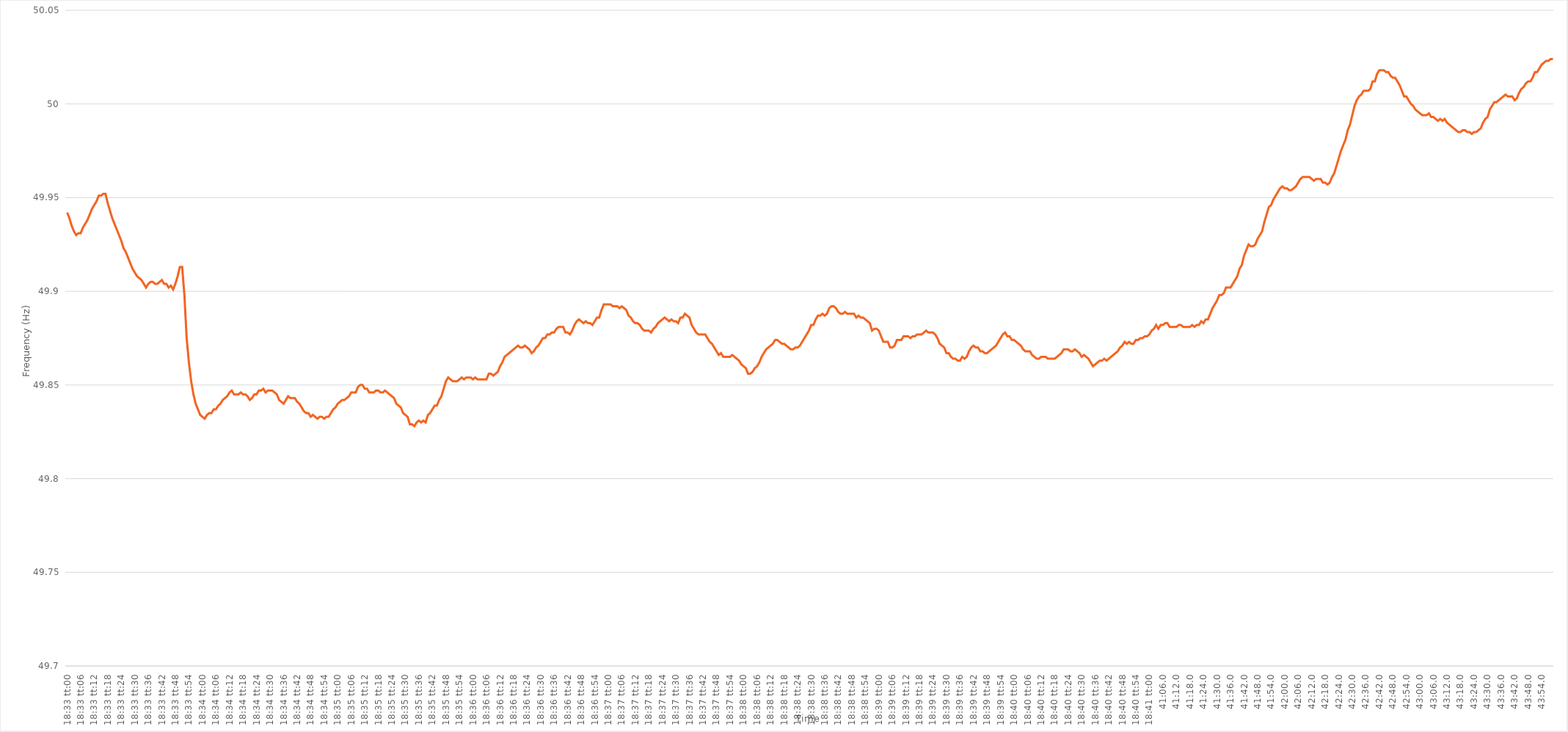
| Category | Series 0 |
|---|---|
| 0.7729166666666667 | 49.942 |
| 0.7729282407407408 | 49.939 |
| 0.7729398148148148 | 49.935 |
| 0.7729513888888889 | 49.932 |
| 0.772962962962963 | 49.93 |
| 0.772974537037037 | 49.931 |
| 0.772986111111111 | 49.931 |
| 0.7729976851851852 | 49.934 |
| 0.7730092592592593 | 49.936 |
| 0.7730208333333333 | 49.938 |
| 0.7730324074074074 | 49.941 |
| 0.7730439814814815 | 49.944 |
| 0.7730555555555556 | 49.946 |
| 0.7730671296296295 | 49.948 |
| 0.7730787037037037 | 49.951 |
| 0.7730902777777778 | 49.951 |
| 0.7731018518518519 | 49.952 |
| 0.7731134259259259 | 49.952 |
| 0.773125 | 49.947 |
| 0.7731365740740741 | 49.943 |
| 0.7731481481481483 | 49.939 |
| 0.7731597222222222 | 49.936 |
| 0.7731712962962963 | 49.933 |
| 0.7731828703703704 | 49.93 |
| 0.7731944444444444 | 49.927 |
| 0.7732060185185184 | 49.923 |
| 0.7732175925925926 | 49.921 |
| 0.7732291666666667 | 49.918 |
| 0.7732407407407407 | 49.915 |
| 0.7732523148148148 | 49.912 |
| 0.7732638888888889 | 49.91 |
| 0.773275462962963 | 49.908 |
| 0.7732870370370369 | 49.907 |
| 0.7732986111111111 | 49.906 |
| 0.7733101851851852 | 49.904 |
| 0.7733217592592593 | 49.902 |
| 0.7733333333333333 | 49.904 |
| 0.7733449074074074 | 49.905 |
| 0.7733564814814815 | 49.905 |
| 0.7733680555555557 | 49.904 |
| 0.7733796296296296 | 49.904 |
| 0.7733912037037037 | 49.905 |
| 0.7734027777777778 | 49.906 |
| 0.7734143518518519 | 49.904 |
| 0.7734259259259259 | 49.904 |
| 0.7734375 | 49.902 |
| 0.7734490740740741 | 49.903 |
| 0.7734606481481481 | 49.901 |
| 0.7734722222222222 | 49.904 |
| 0.7734837962962963 | 49.908 |
| 0.7734953703703704 | 49.913 |
| 0.7735069444444443 | 49.913 |
| 0.7735185185185185 | 49.898 |
| 0.7735300925925926 | 49.875 |
| 0.7735416666666667 | 49.862 |
| 0.7735532407407407 | 49.852 |
| 0.7735648148148148 | 49.845 |
| 0.7735763888888889 | 49.84 |
| 0.7735879629629631 | 49.837 |
| 0.773599537037037 | 49.834 |
| 0.7736111111111111 | 49.833 |
| 0.7736226851851852 | 49.832 |
| 0.7736342592592593 | 49.834 |
| 0.7736458333333333 | 49.835 |
| 0.7736574074074074 | 49.835 |
| 0.7736689814814816 | 49.837 |
| 0.7736805555555556 | 49.837 |
| 0.7736921296296296 | 49.839 |
| 0.7737037037037037 | 49.84 |
| 0.7737152777777778 | 49.842 |
| 0.7737268518518517 | 49.843 |
| 0.7737384259259259 | 49.844 |
| 0.77375 | 49.846 |
| 0.7737615740740741 | 49.847 |
| 0.7737731481481481 | 49.845 |
| 0.7737847222222222 | 49.845 |
| 0.7737962962962963 | 49.845 |
| 0.7738078703703705 | 49.846 |
| 0.7738194444444444 | 49.845 |
| 0.7738310185185185 | 49.845 |
| 0.7738425925925926 | 49.844 |
| 0.7738541666666667 | 49.842 |
| 0.7738657407407407 | 49.843 |
| 0.7738773148148148 | 49.845 |
| 0.773888888888889 | 49.845 |
| 0.773900462962963 | 49.847 |
| 0.773912037037037 | 49.847 |
| 0.7739236111111111 | 49.848 |
| 0.7739351851851852 | 49.846 |
| 0.7739467592592592 | 49.847 |
| 0.7739583333333333 | 49.847 |
| 0.7739699074074075 | 49.847 |
| 0.7739814814814815 | 49.846 |
| 0.7739930555555555 | 49.845 |
| 0.7740046296296296 | 49.842 |
| 0.7740162037037037 | 49.841 |
| 0.7740277777777779 | 49.84 |
| 0.7740393518518518 | 49.842 |
| 0.774050925925926 | 49.844 |
| 0.7740625 | 49.843 |
| 0.7740740740740741 | 49.843 |
| 0.7740856481481481 | 49.843 |
| 0.7740972222222222 | 49.841 |
| 0.7741087962962964 | 49.84 |
| 0.7741203703703704 | 49.838 |
| 0.7741319444444444 | 49.836 |
| 0.7741435185185185 | 49.835 |
| 0.7741550925925926 | 49.835 |
| 0.7741666666666666 | 49.833 |
| 0.7741782407407407 | 49.834 |
| 0.7741898148148149 | 49.833 |
| 0.7742013888888889 | 49.832 |
| 0.7742129629629629 | 49.833 |
| 0.774224537037037 | 49.833 |
| 0.7742361111111111 | 49.832 |
| 0.7742476851851853 | 49.833 |
| 0.7742592592592592 | 49.833 |
| 0.7742708333333334 | 49.835 |
| 0.7742824074074074 | 49.837 |
| 0.7742939814814815 | 49.838 |
| 0.7743055555555555 | 49.84 |
| 0.7743171296296296 | 49.841 |
| 0.7743287037037038 | 49.842 |
| 0.7743402777777778 | 49.842 |
| 0.7743518518518518 | 49.843 |
| 0.7743634259259259 | 49.844 |
| 0.774375 | 49.846 |
| 0.774386574074074 | 49.846 |
| 0.7743981481481481 | 49.846 |
| 0.7744097222222223 | 49.849 |
| 0.7744212962962963 | 49.85 |
| 0.7744328703703703 | 49.85 |
| 0.7744444444444444 | 49.848 |
| 0.7744560185185185 | 49.848 |
| 0.7744675925925927 | 49.846 |
| 0.7744791666666666 | 49.846 |
| 0.7744907407407408 | 49.846 |
| 0.7745023148148148 | 49.847 |
| 0.774513888888889 | 49.847 |
| 0.7745254629629629 | 49.846 |
| 0.774537037037037 | 49.846 |
| 0.7745486111111112 | 49.847 |
| 0.7745601851851852 | 49.846 |
| 0.7745717592592593 | 49.845 |
| 0.7745833333333333 | 49.844 |
| 0.7745949074074074 | 49.843 |
| 0.7746064814814814 | 49.84 |
| 0.7746180555555555 | 49.839 |
| 0.7746296296296297 | 49.838 |
| 0.7746412037037037 | 49.835 |
| 0.7746527777777777 | 49.834 |
| 0.7746643518518518 | 49.833 |
| 0.7746759259259259 | 49.829 |
| 0.7746875000000001 | 49.829 |
| 0.774699074074074 | 49.828 |
| 0.7747106481481482 | 49.83 |
| 0.7747222222222222 | 49.831 |
| 0.7747337962962964 | 49.83 |
| 0.7747453703703703 | 49.831 |
| 0.7747569444444444 | 49.83 |
| 0.7747685185185186 | 49.834 |
| 0.7747800925925926 | 49.835 |
| 0.7747916666666667 | 49.837 |
| 0.7748032407407407 | 49.839 |
| 0.7748148148148148 | 49.839 |
| 0.774826388888889 | 49.842 |
| 0.7748379629629629 | 49.844 |
| 0.7748495370370371 | 49.848 |
| 0.7748611111111111 | 49.852 |
| 0.7748726851851853 | 49.854 |
| 0.7748842592592592 | 49.853 |
| 0.7748958333333333 | 49.852 |
| 0.7749074074074075 | 49.852 |
| 0.7749189814814814 | 49.852 |
| 0.7749305555555556 | 49.853 |
| 0.7749421296296296 | 49.854 |
| 0.7749537037037038 | 49.853 |
| 0.7749652777777777 | 49.854 |
| 0.7749768518518518 | 49.854 |
| 0.774988425925926 | 49.854 |
| 0.775 | 49.853 |
| 0.7750115740740741 | 49.854 |
| 0.7750231481481481 | 49.853 |
| 0.7750347222222222 | 49.853 |
| 0.7750462962962964 | 49.853 |
| 0.7750578703703703 | 49.853 |
| 0.7750694444444445 | 49.853 |
| 0.7750810185185185 | 49.856 |
| 0.7750925925925927 | 49.856 |
| 0.7751041666666666 | 49.855 |
| 0.7751157407407407 | 49.856 |
| 0.7751273148148149 | 49.857 |
| 0.7751388888888888 | 49.86 |
| 0.775150462962963 | 49.862 |
| 0.775162037037037 | 49.865 |
| 0.7751736111111112 | 49.866 |
| 0.7751851851851851 | 49.867 |
| 0.7751967592592592 | 49.868 |
| 0.7752083333333334 | 49.869 |
| 0.7752199074074074 | 49.87 |
| 0.7752314814814815 | 49.871 |
| 0.7752430555555555 | 49.87 |
| 0.7752546296296297 | 49.87 |
| 0.7752662037037038 | 49.871 |
| 0.7752777777777777 | 49.87 |
| 0.7752893518518519 | 49.869 |
| 0.7753009259259259 | 49.867 |
| 0.7753125000000001 | 49.868 |
| 0.775324074074074 | 49.87 |
| 0.7753356481481481 | 49.871 |
| 0.7753472222222223 | 49.873 |
| 0.7753587962962962 | 49.875 |
| 0.7753703703703704 | 49.875 |
| 0.7753819444444444 | 49.877 |
| 0.7753935185185186 | 49.877 |
| 0.7754050925925925 | 49.878 |
| 0.7754166666666666 | 49.878 |
| 0.7754282407407408 | 49.88 |
| 0.7754398148148148 | 49.881 |
| 0.7754513888888889 | 49.881 |
| 0.7754629629629629 | 49.881 |
| 0.7754745370370371 | 49.878 |
| 0.7754861111111112 | 49.878 |
| 0.7754976851851851 | 49.877 |
| 0.7755092592592593 | 49.879 |
| 0.7755208333333333 | 49.882 |
| 0.7755324074074075 | 49.884 |
| 0.7755439814814814 | 49.885 |
| 0.7755555555555556 | 49.884 |
| 0.7755671296296297 | 49.883 |
| 0.7755787037037036 | 49.884 |
| 0.7755902777777778 | 49.883 |
| 0.7756018518518518 | 49.883 |
| 0.775613425925926 | 49.882 |
| 0.7756249999999999 | 49.884 |
| 0.775636574074074 | 49.886 |
| 0.7756481481481482 | 49.886 |
| 0.7756597222222222 | 49.89 |
| 0.7756712962962963 | 49.893 |
| 0.7756828703703703 | 49.893 |
| 0.7756944444444445 | 49.893 |
| 0.7757060185185186 | 49.893 |
| 0.7757175925925925 | 49.892 |
| 0.7757291666666667 | 49.892 |
| 0.7757407407407407 | 49.892 |
| 0.7757523148148149 | 49.891 |
| 0.7757638888888888 | 49.892 |
| 0.775775462962963 | 49.891 |
| 0.7757870370370371 | 49.89 |
| 0.775798611111111 | 49.887 |
| 0.7758101851851852 | 49.886 |
| 0.7758217592592592 | 49.884 |
| 0.7758333333333334 | 49.883 |
| 0.7758449074074073 | 49.883 |
| 0.7758564814814815 | 49.882 |
| 0.7758680555555556 | 49.88 |
| 0.7758796296296296 | 49.879 |
| 0.7758912037037037 | 49.879 |
| 0.7759027777777777 | 49.879 |
| 0.7759143518518519 | 49.878 |
| 0.775925925925926 | 49.88 |
| 0.7759375 | 49.881 |
| 0.7759490740740741 | 49.883 |
| 0.7759606481481481 | 49.884 |
| 0.7759722222222223 | 49.885 |
| 0.7759837962962962 | 49.886 |
| 0.7759953703703704 | 49.885 |
| 0.7760069444444445 | 49.884 |
| 0.7760185185185186 | 49.885 |
| 0.7760300925925926 | 49.884 |
| 0.7760416666666666 | 49.884 |
| 0.7760532407407408 | 49.883 |
| 0.7760648148148147 | 49.886 |
| 0.7760763888888889 | 49.886 |
| 0.776087962962963 | 49.888 |
| 0.776099537037037 | 49.887 |
| 0.7761111111111111 | 49.886 |
| 0.7761226851851851 | 49.882 |
| 0.7761342592592593 | 49.88 |
| 0.7761458333333334 | 49.878 |
| 0.7761574074074074 | 49.877 |
| 0.7761689814814815 | 49.877 |
| 0.7761805555555555 | 49.877 |
| 0.7761921296296297 | 49.877 |
| 0.7762037037037036 | 49.875 |
| 0.7762152777777778 | 49.873 |
| 0.7762268518518519 | 49.872 |
| 0.776238425925926 | 49.87 |
| 0.77625 | 49.868 |
| 0.776261574074074 | 49.866 |
| 0.7762731481481482 | 49.867 |
| 0.7762847222222223 | 49.865 |
| 0.7762962962962963 | 49.865 |
| 0.7763078703703704 | 49.865 |
| 0.7763194444444445 | 49.865 |
| 0.7763310185185185 | 49.866 |
| 0.7763425925925925 | 49.865 |
| 0.7763541666666667 | 49.864 |
| 0.7763657407407408 | 49.863 |
| 0.7763773148148148 | 49.861 |
| 0.7763888888888889 | 49.86 |
| 0.776400462962963 | 49.859 |
| 0.7764120370370371 | 49.856 |
| 0.776423611111111 | 49.856 |
| 0.7764351851851852 | 49.857 |
| 0.7764467592592593 | 49.859 |
| 0.7764583333333334 | 49.86 |
| 0.7764699074074074 | 49.862 |
| 0.7764814814814814 | 49.865 |
| 0.7764930555555556 | 49.867 |
| 0.7765046296296297 | 49.869 |
| 0.7765162037037037 | 49.87 |
| 0.7765277777777778 | 49.871 |
| 0.7765393518518519 | 49.872 |
| 0.7765509259259259 | 49.874 |
| 0.7765624999999999 | 49.874 |
| 0.7765740740740741 | 49.873 |
| 0.7765856481481482 | 49.872 |
| 0.7765972222222222 | 49.872 |
| 0.7766087962962963 | 49.871 |
| 0.7766203703703703 | 49.87 |
| 0.7766319444444445 | 49.869 |
| 0.7766435185185184 | 49.869 |
| 0.7766550925925926 | 49.87 |
| 0.7766666666666667 | 49.87 |
| 0.7766782407407408 | 49.871 |
| 0.7766898148148148 | 49.873 |
| 0.7767013888888888 | 49.875 |
| 0.776712962962963 | 49.877 |
| 0.7767245370370371 | 49.879 |
| 0.7767361111111111 | 49.882 |
| 0.7767476851851852 | 49.882 |
| 0.7767592592592593 | 49.885 |
| 0.7767708333333333 | 49.887 |
| 0.7767824074074073 | 49.887 |
| 0.7767939814814815 | 49.888 |
| 0.7768055555555556 | 49.887 |
| 0.7768171296296296 | 49.888 |
| 0.7768287037037037 | 49.891 |
| 0.7768402777777778 | 49.892 |
| 0.7768518518518519 | 49.892 |
| 0.7768634259259258 | 49.891 |
| 0.776875 | 49.889 |
| 0.7768865740740741 | 49.888 |
| 0.7768981481481482 | 49.888 |
| 0.7769097222222222 | 49.889 |
| 0.7769212962962962 | 49.888 |
| 0.7769328703703704 | 49.888 |
| 0.7769444444444445 | 49.888 |
| 0.7769560185185185 | 49.888 |
| 0.7769675925925926 | 49.886 |
| 0.7769791666666667 | 49.887 |
| 0.7769907407407407 | 49.886 |
| 0.7770023148148147 | 49.886 |
| 0.7770138888888889 | 49.885 |
| 0.777025462962963 | 49.884 |
| 0.777037037037037 | 49.883 |
| 0.7770486111111111 | 49.879 |
| 0.7770601851851852 | 49.88 |
| 0.7770717592592593 | 49.88 |
| 0.7770833333333332 | 49.879 |
| 0.7770949074074074 | 49.876 |
| 0.7771064814814815 | 49.873 |
| 0.7771180555555556 | 49.873 |
| 0.7771296296296296 | 49.873 |
| 0.7771412037037037 | 49.87 |
| 0.7771527777777778 | 49.87 |
| 0.777164351851852 | 49.871 |
| 0.7771759259259259 | 49.874 |
| 0.7771875 | 49.874 |
| 0.7771990740740741 | 49.874 |
| 0.7772106481481481 | 49.876 |
| 0.7772222222222221 | 49.876 |
| 0.7772337962962963 | 49.876 |
| 0.7772453703703704 | 49.875 |
| 0.7772569444444444 | 49.876 |
| 0.7772685185185185 | 49.876 |
| 0.7772800925925926 | 49.877 |
| 0.7772916666666667 | 49.877 |
| 0.7773032407407406 | 49.877 |
| 0.7773148148148148 | 49.878 |
| 0.7773263888888889 | 49.879 |
| 0.777337962962963 | 49.878 |
| 0.777349537037037 | 49.878 |
| 0.7773611111111111 | 49.878 |
| 0.7773726851851852 | 49.877 |
| 0.7773842592592594 | 49.875 |
| 0.7773958333333333 | 49.872 |
| 0.7774074074074074 | 49.871 |
| 0.7774189814814815 | 49.87 |
| 0.7774305555555556 | 49.867 |
| 0.7774421296296296 | 49.867 |
| 0.7774537037037037 | 49.865 |
| 0.7774652777777779 | 49.864 |
| 0.7774768518518519 | 49.864 |
| 0.7774884259259259 | 49.863 |
| 0.7775 | 49.863 |
| 0.7775115740740741 | 49.865 |
| 0.777523148148148 | 49.864 |
| 0.7775347222222222 | 49.865 |
| 0.7775462962962963 | 49.868 |
| 0.7775578703703704 | 49.87 |
| 0.7775694444444444 | 49.871 |
| 0.7775810185185185 | 49.87 |
| 0.7775925925925926 | 49.87 |
| 0.7776041666666668 | 49.868 |
| 0.7776157407407407 | 49.868 |
| 0.7776273148148148 | 49.867 |
| 0.7776388888888889 | 49.867 |
| 0.777650462962963 | 49.868 |
| 0.777662037037037 | 49.869 |
| 0.7776736111111111 | 49.87 |
| 0.7776851851851853 | 49.871 |
| 0.7776967592592593 | 49.873 |
| 0.7777083333333333 | 49.875 |
| 0.7777199074074074 | 49.877 |
| 0.7777314814814815 | 49.878 |
| 0.7777430555555555 | 49.876 |
| 0.7777546296296296 | 49.876 |
| 0.7777662037037038 | 49.874 |
| 0.7777777777777778 | 49.874 |
| 0.7777893518518518 | 49.873 |
| 0.7778009259259259 | 49.872 |
| 0.7778125 | 49.871 |
| 0.7778240740740742 | 49.869 |
| 0.7778356481481481 | 49.868 |
| 0.7778472222222222 | 49.868 |
| 0.7778587962962963 | 49.868 |
| 0.7778703703703704 | 49.866 |
| 0.7778819444444444 | 49.865 |
| 0.7778935185185185 | 49.864 |
| 0.7779050925925927 | 49.864 |
| 0.7779166666666667 | 49.865 |
| 0.7779282407407407 | 49.865 |
| 0.7779398148148148 | 49.865 |
| 0.7779513888888889 | 49.864 |
| 0.7779629629629629 | 49.864 |
| 0.777974537037037 | 49.864 |
| 0.7779861111111112 | 49.864 |
| 0.7779976851851852 | 49.865 |
| 0.7780092592592592 | 49.866 |
| 0.7780208333333333 | 49.867 |
| 0.7780324074074074 | 49.869 |
| 0.7780439814814816 | 49.869 |
| 0.7780555555555555 | 49.869 |
| 0.7780671296296297 | 49.868 |
| 0.7780787037037037 | 49.868 |
| 0.7780902777777778 | 49.869 |
| 0.7781018518518518 | 49.868 |
| 0.7781134259259259 | 49.867 |
| 0.7781250000000001 | 49.865 |
| 0.7781365740740741 | 49.866 |
| 0.7781481481481481 | 49.865 |
| 0.7781597222222222 | 49.864 |
| 0.7781712962962963 | 49.862 |
| 0.7781828703703703 | 49.86 |
| 0.7781944444444444 | 49.861 |
| 0.7782060185185186 | 49.862 |
| 0.7782175925925926 | 49.863 |
| 0.7782291666666666 | 49.863 |
| 0.7782407407407407 | 49.864 |
| 0.7782523148148148 | 49.863 |
| 0.778263888888889 | 49.864 |
| 0.7782754629629629 | 49.865 |
| 0.778287037037037 | 49.866 |
| 0.7782986111111111 | 49.867 |
| 0.7783101851851852 | 49.868 |
| 0.7783217592592592 | 49.87 |
| 0.7783333333333333 | 49.871 |
| 0.7783449074074075 | 49.873 |
| 0.7783564814814815 | 49.872 |
| 0.7783680555555555 | 49.873 |
| 0.7783796296296296 | 49.872 |
| 0.7783912037037037 | 49.872 |
| 0.7784027777777777 | 49.874 |
| 0.7784143518518518 | 49.874 |
| 0.778425925925926 | 49.875 |
| 0.7784375 | 49.875 |
| 0.778449074074074 | 49.876 |
| 0.7784606481481481 | 49.876 |
| 0.7784722222222222 | 49.877 |
| 0.7784837962962964 | 49.879 |
| 0.7784953703703703 | 49.88 |
| 0.7785069444444445 | 49.882 |
| 0.7785185185185185 | 49.88 |
| 0.7785300925925926 | 49.882 |
| 0.7785416666666666 | 49.882 |
| 0.7785532407407407 | 49.883 |
| 0.7785648148148149 | 49.883 |
| 0.7785763888888889 | 49.881 |
| 0.778587962962963 | 49.881 |
| 0.778599537037037 | 49.881 |
| 0.7786111111111111 | 49.881 |
| 0.7786226851851853 | 49.882 |
| 0.7786342592592592 | 49.882 |
| 0.7786458333333334 | 49.881 |
| 0.7786574074074074 | 49.881 |
| 0.7786689814814814 | 49.881 |
| 0.7786805555555555 | 49.881 |
| 0.7786921296296296 | 49.882 |
| 0.7787037037037038 | 49.881 |
| 0.7787152777777777 | 49.882 |
| 0.7787268518518519 | 49.882 |
| 0.7787384259259259 | 49.884 |
| 0.77875 | 49.883 |
| 0.778761574074074 | 49.885 |
| 0.7787731481481481 | 49.885 |
| 0.7787847222222223 | 49.888 |
| 0.7787962962962963 | 49.891 |
| 0.7788078703703704 | 49.893 |
| 0.7788194444444444 | 49.895 |
| 0.7788310185185185 | 49.898 |
| 0.7788425925925927 | 49.898 |
| 0.7788541666666666 | 49.899 |
| 0.7788657407407408 | 49.902 |
| 0.7788773148148148 | 49.902 |
| 0.778888888888889 | 49.902 |
| 0.7789004629629629 | 49.904 |
| 0.778912037037037 | 49.906 |
| 0.7789236111111112 | 49.908 |
| 0.7789351851851851 | 49.912 |
| 0.7789467592592593 | 49.914 |
| 0.7789583333333333 | 49.919 |
| 0.7789699074074075 | 49.922 |
| 0.7789814814814814 | 49.925 |
| 0.7789930555555555 | 49.924 |
| 0.7790046296296297 | 49.924 |
| 0.7790162037037037 | 49.925 |
| 0.7790277777777778 | 49.928 |
| 0.7790393518518518 | 49.93 |
| 0.779050925925926 | 49.932 |
| 0.7790625000000001 | 49.937 |
| 0.779074074074074 | 49.941 |
| 0.7790856481481482 | 49.945 |
| 0.7790972222222222 | 49.946 |
| 0.7791087962962964 | 49.949 |
| 0.7791203703703703 | 49.951 |
| 0.7791319444444444 | 49.953 |
| 0.7791435185185186 | 49.955 |
| 0.7791550925925925 | 49.956 |
| 0.7791666666666667 | 49.955 |
| 0.7791782407407407 | 49.955 |
| 0.7791898148148149 | 49.954 |
| 0.7792013888888888 | 49.954 |
| 0.7792129629629629 | 49.955 |
| 0.7792245370370371 | 49.956 |
| 0.7792361111111111 | 49.958 |
| 0.7792476851851852 | 49.96 |
| 0.7792592592592592 | 49.961 |
| 0.7792708333333334 | 49.961 |
| 0.7792824074074075 | 49.961 |
| 0.7792939814814814 | 49.961 |
| 0.7793055555555556 | 49.96 |
| 0.7793171296296296 | 49.959 |
| 0.7793287037037038 | 49.96 |
| 0.7793402777777777 | 49.96 |
| 0.7793518518518519 | 49.96 |
| 0.779363425925926 | 49.958 |
| 0.7793749999999999 | 49.958 |
| 0.7793865740740741 | 49.957 |
| 0.7793981481481481 | 49.958 |
| 0.7794097222222223 | 49.961 |
| 0.7794212962962962 | 49.963 |
| 0.7794328703703703 | 49.967 |
| 0.7794444444444445 | 49.971 |
| 0.7794560185185185 | 49.975 |
| 0.7794675925925926 | 49.978 |
| 0.7794791666666666 | 49.981 |
| 0.7794907407407408 | 49.986 |
| 0.7795023148148149 | 49.989 |
| 0.7795138888888888 | 49.994 |
| 0.779525462962963 | 49.999 |
| 0.779537037037037 | 50.002 |
| 0.7795486111111112 | 50.004 |
| 0.7795601851851851 | 50.005 |
| 0.7795717592592593 | 50.007 |
| 0.7795833333333334 | 50.007 |
| 0.7795949074074073 | 50.007 |
| 0.7796064814814815 | 50.008 |
| 0.7796180555555555 | 50.012 |
| 0.7796296296296297 | 50.012 |
| 0.7796412037037036 | 50.016 |
| 0.7796527777777778 | 50.018 |
| 0.7796643518518519 | 50.018 |
| 0.7796759259259259 | 50.018 |
| 0.7796875 | 50.017 |
| 0.779699074074074 | 50.017 |
| 0.7797106481481482 | 50.015 |
| 0.7797222222222223 | 50.014 |
| 0.7797337962962962 | 50.014 |
| 0.7797453703703704 | 50.012 |
| 0.7797569444444444 | 50.01 |
| 0.7797685185185186 | 50.007 |
| 0.7797800925925925 | 50.004 |
| 0.7797916666666667 | 50.004 |
| 0.7798032407407408 | 50.002 |
| 0.7798148148148147 | 50 |
| 0.7798263888888889 | 49.999 |
| 0.7798379629629629 | 49.997 |
| 0.7798495370370371 | 49.996 |
| 0.779861111111111 | 49.995 |
| 0.7798726851851852 | 49.994 |
| 0.7798842592592593 | 49.994 |
| 0.7798958333333333 | 49.994 |
| 0.7799074074074074 | 49.995 |
| 0.7799189814814814 | 49.993 |
| 0.7799305555555556 | 49.993 |
| 0.7799421296296297 | 49.992 |
| 0.7799537037037036 | 49.991 |
| 0.7799652777777778 | 49.992 |
| 0.7799768518518518 | 49.991 |
| 0.779988425925926 | 49.992 |
| 0.7799999999999999 | 49.99 |
| 0.7800115740740741 | 49.989 |
| 0.7800231481481482 | 49.988 |
| 0.7800347222222223 | 49.987 |
| 0.7800462962962963 | 49.986 |
| 0.7800578703703703 | 49.985 |
| 0.7800694444444445 | 49.985 |
| 0.7800810185185186 | 49.986 |
| 0.7800925925925926 | 49.986 |
| 0.7801041666666667 | 49.985 |
| 0.7801157407407407 | 49.985 |
| 0.7801273148148148 | 49.984 |
| 0.7801388888888888 | 49.985 |
| 0.780150462962963 | 49.985 |
| 0.7801620370370371 | 49.986 |
| 0.780173611111111 | 49.987 |
| 0.7801851851851852 | 49.99 |
| 0.7801967592592592 | 49.992 |
| 0.7802083333333334 | 49.993 |
| 0.7802199074074073 | 49.997 |
| 0.7802314814814815 | 49.999 |
| 0.7802430555555556 | 50.001 |
| 0.7802546296296297 | 50.001 |
| 0.7802662037037037 | 50.002 |
| 0.7802777777777777 | 50.003 |
| 0.7802893518518519 | 50.004 |
| 0.780300925925926 | 50.005 |
| 0.7803125 | 50.004 |
| 0.7803240740740741 | 50.004 |
| 0.7803356481481482 | 50.004 |
| 0.7803472222222222 | 50.002 |
| 0.7803587962962962 | 50.003 |
| 0.7803703703703704 | 50.006 |
| 0.7803819444444445 | 50.008 |
| 0.7803935185185185 | 50.009 |
| 0.7804050925925926 | 50.011 |
| 0.7804166666666666 | 50.012 |
| 0.7804282407407408 | 50.012 |
| 0.7804398148148147 | 50.014 |
| 0.7804513888888889 | 50.017 |
| 0.780462962962963 | 50.017 |
| 0.7804745370370371 | 50.019 |
| 0.7804861111111111 | 50.021 |
| 0.7804976851851851 | 50.022 |
| 0.7805092592592593 | 50.023 |
| 0.7805208333333334 | 50.023 |
| 0.7805324074074074 | 50.024 |
| 0.7805439814814815 | 50.024 |